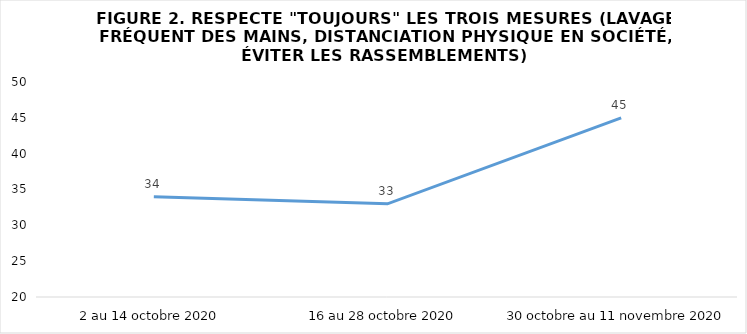
| Category | Series 0 |
|---|---|
| 2 au 14 octobre 2020 | 34 |
| 16 au 28 octobre 2020 | 33 |
| 30 octobre au 11 novembre 2020 | 45 |